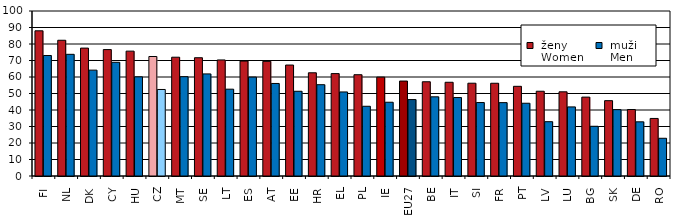
| Category |  ženy 
 Women |  muži 
 Men |
|---|---|---|
| FI | 88.001 | 73.039 |
| NL | 82.266 | 73.746 |
| DK | 77.516 | 64.16 |
| CY | 76.614 | 68.913 |
| HU | 75.68 | 60.097 |
| CZ | 72.42 | 52.438 |
| MT | 71.991 | 60.193 |
| SE | 71.677 | 61.879 |
| LT | 70.34 | 52.622 |
| ES | 69.666 | 59.94 |
| AT | 69.482 | 56.085 |
| EE | 67.248 | 51.354 |
| HR | 62.556 | 55.334 |
| EL | 62.056 | 50.942 |
| PL | 61.388 | 42.26 |
| IE | 59.918 | 44.703 |
| EU27 | 57.545 | 46.323 |
| BE | 57.121 | 47.995 |
| IT | 56.8 | 47.548 |
| SI | 56.236 | 44.518 |
| FR | 56.212 | 44.469 |
| PT | 54.35 | 44.096 |
| LV | 51.367 | 32.916 |
| LU | 51.014 | 41.871 |
| BG | 47.81 | 30.139 |
| SK | 45.656 | 40.226 |
| DE | 40.287 | 32.838 |
| RO | 34.879 | 22.867 |